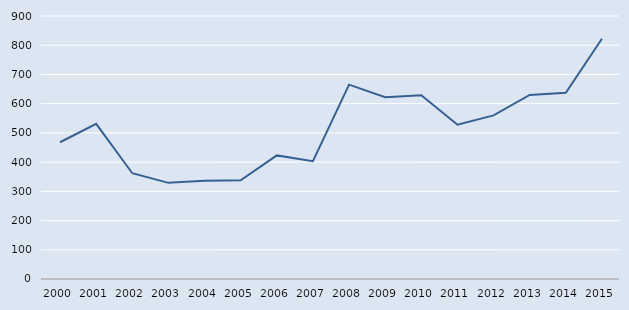
| Category | Series 0 |
|---|---|
| 2000.0 | 468 |
| 2001.0 | 531 |
| 2002.0 | 362 |
| 2003.0 | 329 |
| 2004.0 | 336 |
| 2005.0 | 338 |
| 2006.0 | 423 |
| 2007.0 | 403 |
| 2008.0 | 665 |
| 2009.0 | 622 |
| 2010.0 | 629 |
| 2011.0 | 528 |
| 2012.0 | 560 |
| 2013.0 | 630 |
| 2014.0 | 637 |
| 2015.0 | 822 |